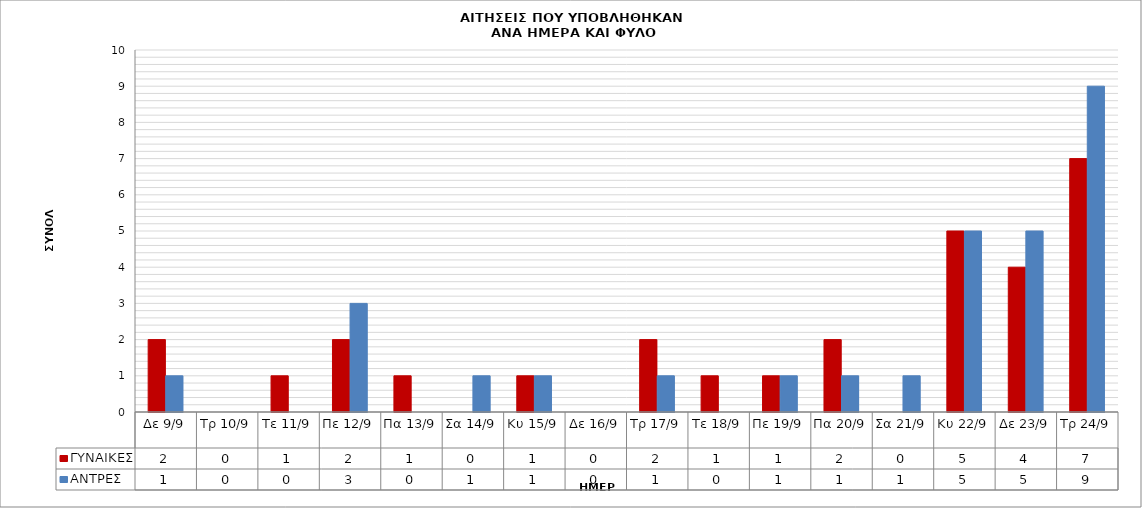
| Category | ΓΥΝΑΙΚΕΣ | ΑΝΤΡΕΣ |
|---|---|---|
| Δε 9/9 | 2 | 1 |
| Τρ 10/9 | 0 | 0 |
| Τε 11/9 | 1 | 0 |
| Πε 12/9 | 2 | 3 |
| Πα 13/9 | 1 | 0 |
| Σα 14/9 | 0 | 1 |
| Κυ 15/9 | 1 | 1 |
| Δε 16/9 | 0 | 0 |
| Τρ 17/9 | 2 | 1 |
| Τε 18/9 | 1 | 0 |
| Πε 19/9 | 1 | 1 |
| Πα 20/9 | 2 | 1 |
| Σα 21/9 | 0 | 1 |
| Κυ 22/9 | 5 | 5 |
| Δε 23/9 | 4 | 5 |
| Τρ 24/9 | 7 | 9 |